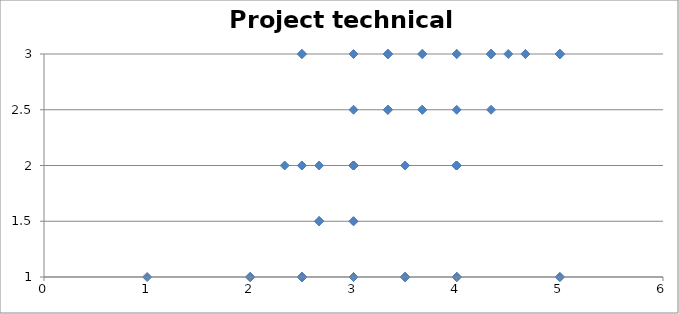
| Category | Project technical newness |
|---|---|
| 3.0 | 2 |
| 1.0 | 1 |
| 2.0 | 1 |
| 3.0 | 1 |
| 4.0 | 1 |
| 3.0 | 1.5 |
| 4.333333333333333 | 3 |
| 2.0 | 1 |
| 2.5 | 3 |
| 2.5 | 2 |
| 5.0 | 1 |
| 3.5 | 1 |
| 3.0 | 3 |
| 3.3333333333333335 | 3 |
| 3.3333333333333335 | 3 |
| 5.0 | 1 |
| 4.0 | 1 |
| 3.5 | 1 |
| 3.0 | 1 |
| 4.0 | 1 |
| 3.0 | 1 |
| 3.5 | 2 |
| 2.5 | 1 |
| 2.6666666666666665 | 1.5 |
| 2.6666666666666665 | 1.5 |
| 3.0 | 2 |
| 3.3333333333333335 | 3 |
| 2.3333333333333335 | 2 |
| 4.0 | 1 |
| 4.333333333333333 | 3 |
| 3.0 | 2 |
| 3.0 | 1 |
| 2.5 | 1 |
| 3.0 | 2 |
| 2.0 | 1 |
| 3.0 | 2 |
| 4.333333333333333 | 2.5 |
| 5.0 | 3 |
| 3.0 | 2 |
| 4.0 | 2 |
| 2.5 | 1 |
| 3.0 | 2 |
| 3.0 | 1 |
| 3.0 | 1 |
| 2.5 | 1 |
| 3.0 | 1 |
| 3.0 | 1 |
| 3.0 | 1 |
| 4.0 | 3 |
| 4.333333333333333 | 3 |
| 2.6666666666666665 | 1.5 |
| 2.0 | 1 |
| 5.0 | 3 |
| 3.0 | 2 |
| 4.0 | 1 |
| 2.5 | 1 |
| 3.0 | 1 |
| 3.0 | 1 |
| 2.5 | 1 |
| 3.0 | 1 |
| 3.0 | 1.5 |
| 5.0 | 3 |
| 3.6666666666666665 | 2.5 |
| 3.0 | 2 |
| 2.5 | 2 |
| 3.0 | 2 |
| 4.0 | 2 |
| 3.5 | 1 |
| 3.6666666666666665 | 2.5 |
| 3.0 | 1 |
| 3.0 | 1 |
| 3.0 | 1 |
| 3.0 | 1 |
| 3.0 | 1 |
| 2.6666666666666665 | 1.5 |
| 4.666666666666667 | 3 |
| 4.666666666666667 | 3 |
| 3.0 | 1 |
| 3.0 | 1 |
| 2.6666666666666665 | 2 |
| 2.5 | 3 |
| 3.0 | 1 |
| 3.0 | 1 |
| 3.0 | 2 |
| 3.6666666666666665 | 3 |
| 3.6666666666666665 | 3 |
| 4.0 | 2.5 |
| 2.5 | 1 |
| 4.0 | 2 |
| 3.3333333333333335 | 2.5 |
| 3.0 | 1 |
| 2.0 | 1 |
| 3.0 | 1 |
| 3.0 | 1 |
| 4.5 | 3 |
| 3.3333333333333335 | 3 |
| 3.0 | 2.5 |
| 3.0 | 1 |
| 2.0 | 1 |
| 4.0 | 3 |
| 3.0 | 1 |
| 4.333333333333333 | 3 |
| 3.0 | 2 |
| 3.0 | 2 |
| 3.0 | 2 |
| 3.0 | 1 |
| 3.3333333333333335 | 2.5 |
| 3.5 | 1 |
| 4.0 | 1 |
| 5.0 | 3 |
| 3.3333333333333335 | 2.5 |
| 4.0 | 3 |
| 2.5 | 1 |
| 4.0 | 2 |
| 4.0 | 2 |